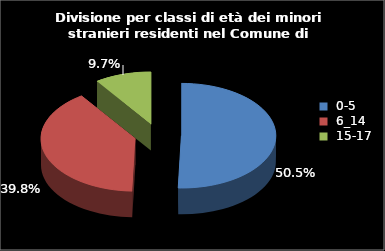
| Category | Series 0 |
|---|---|
| 0-5 | 47 |
| 6_14 | 37 |
| 15-17 | 9 |